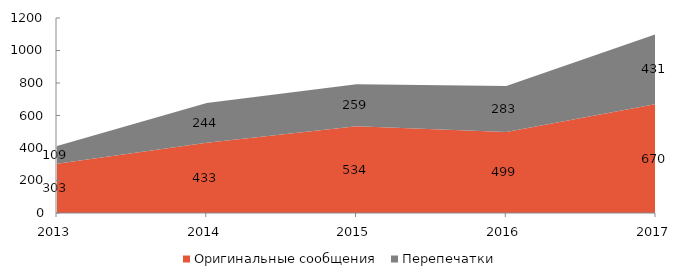
| Category | Оригинальные сообщения | Перепечатки |
|---|---|---|
| 2013 | 303 | 109 |
| 2014 | 433 | 244 |
| 2015 | 534 | 259 |
| 2016 | 499 | 283 |
| 2017 | 670 | 431 |